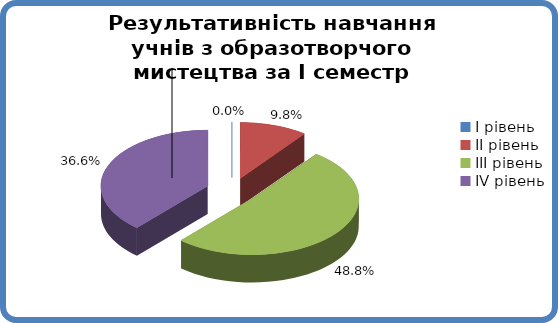
| Category | Series 0 |
|---|---|
| 0 | 0 |
| 1 | 0.098 |
| 2 | 0.488 |
| 3 | 0.366 |